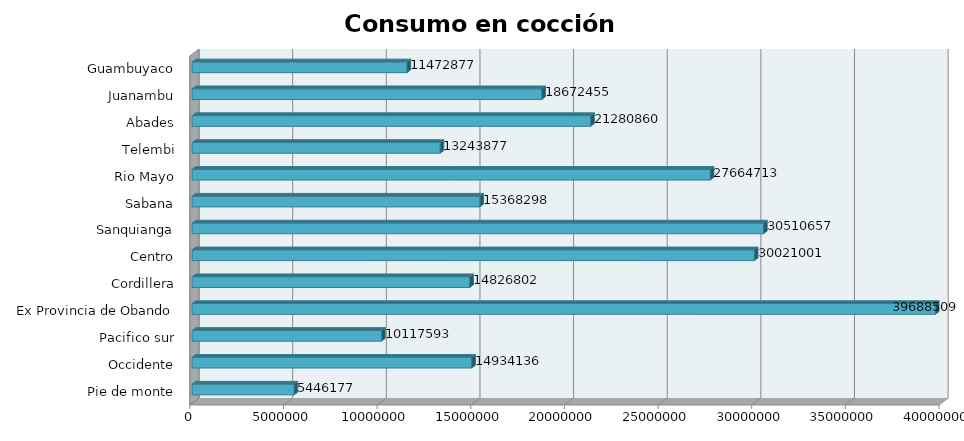
| Category | Series 0 |
|---|---|
| Pie de monte | 5446177.34 |
| Occidente | 14934136.379 |
| Pacifico sur | 10117592.632 |
| Ex Provincia de Obando | 39688509.143 |
| Cordillera | 14826802.176 |
| Centro | 30021000.938 |
| Sanquianga | 30510657.203 |
| Sabana | 15368298.362 |
| Rio Mayo | 27664712.63 |
| Telembi | 13243876.538 |
| Abades | 21280860.132 |
| Juanambu | 18672454.881 |
| Guambuyaco | 11472876.971 |